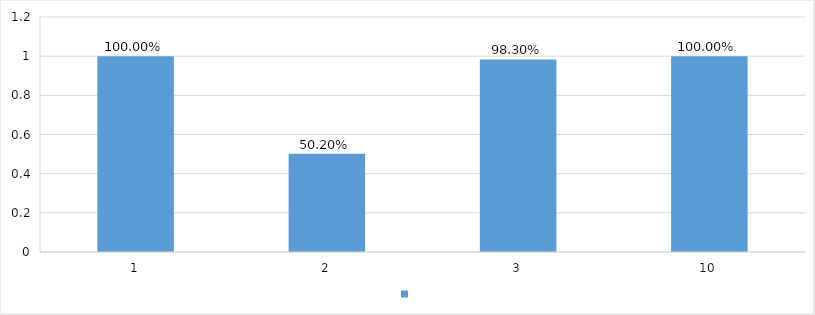
| Category | Series 0 |
|---|---|
| 1 | 1 |
| 2 | 0.502 |
| 3 | 0.983 |
| 10 | 1 |